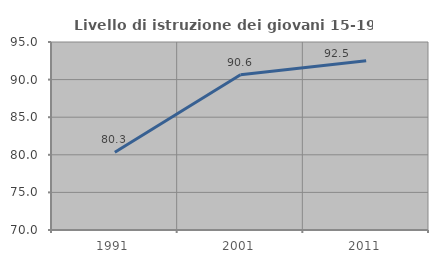
| Category | Livello di istruzione dei giovani 15-19 anni |
|---|---|
| 1991.0 | 80.338 |
| 2001.0 | 90.636 |
| 2011.0 | 92.517 |